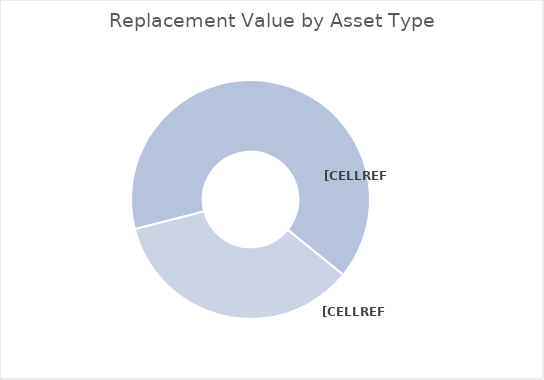
| Category | Series 1 |
|---|---|
| Light Trucks | 19000 |
| Cars | 35000 |
| ATVs | 0 |
| Snowmobiles | 0 |
| Other | 0 |